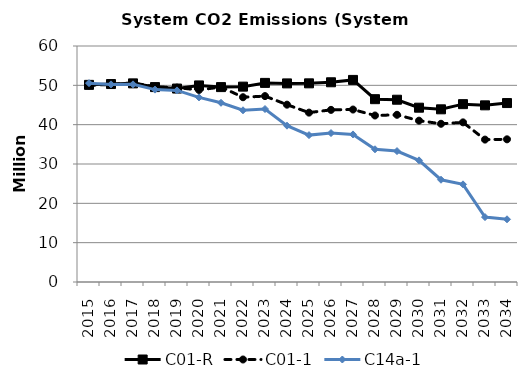
| Category | C01-R | C01-1 | C14a-1 |
|---|---|---|---|
| 2015.0 | 50.118 | 49.98 | 50.551 |
| 2016.0 | 50.329 | 50.239 | 50.242 |
| 2017.0 | 50.499 | 50.623 | 50.249 |
| 2018.0 | 49.555 | 49.637 | 48.91 |
| 2019.0 | 49.181 | 49.422 | 48.71 |
| 2020.0 | 49.976 | 48.827 | 46.925 |
| 2021.0 | 49.548 | 49.578 | 45.562 |
| 2022.0 | 49.671 | 46.971 | 43.657 |
| 2023.0 | 50.618 | 47.262 | 43.979 |
| 2024.0 | 50.491 | 45.086 | 39.744 |
| 2025.0 | 50.508 | 43.063 | 37.344 |
| 2026.0 | 50.777 | 43.764 | 37.867 |
| 2027.0 | 51.38 | 43.847 | 37.519 |
| 2028.0 | 46.481 | 42.329 | 33.743 |
| 2029.0 | 46.342 | 42.511 | 33.283 |
| 2030.0 | 44.317 | 41.021 | 30.925 |
| 2031.0 | 43.901 | 40.228 | 25.998 |
| 2032.0 | 45.215 | 40.585 | 24.826 |
| 2033.0 | 44.915 | 36.207 | 16.499 |
| 2034.0 | 45.496 | 36.272 | 15.945 |